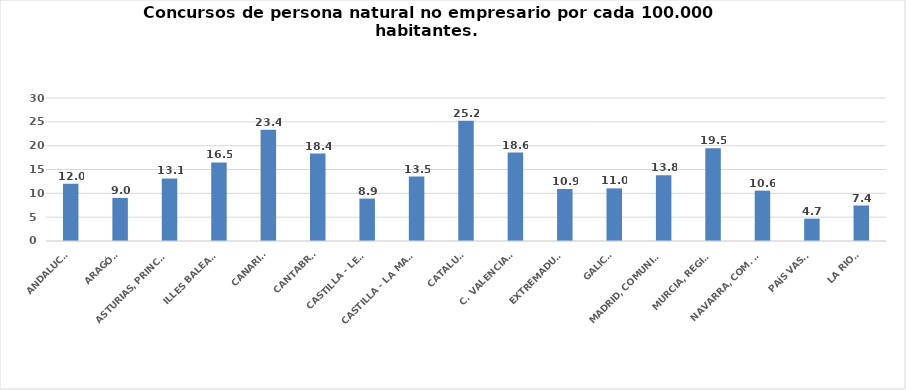
| Category | Series 0 |
|---|---|
| ANDALUCÍA | 12.03 |
| ARAGÓN | 9.042 |
| ASTURIAS, PRINCIPADO | 13.113 |
| ILLES BALEARS | 16.491 |
| CANARIAS | 23.363 |
| CANTABRIA | 18.351 |
| CASTILLA - LEÓN | 8.898 |
| CASTILLA - LA MANCHA | 13.506 |
| CATALUÑA | 25.218 |
| C. VALENCIANA | 18.55 |
| EXTREMADURA | 10.908 |
| GALICIA | 11.038 |
| MADRID, COMUNIDAD | 13.783 |
| MURCIA, REGIÓN | 19.45 |
| NAVARRA, COM. FORAL | 10.562 |
| PAÍS VASCO | 4.685 |
| LA RIOJA | 7.447 |